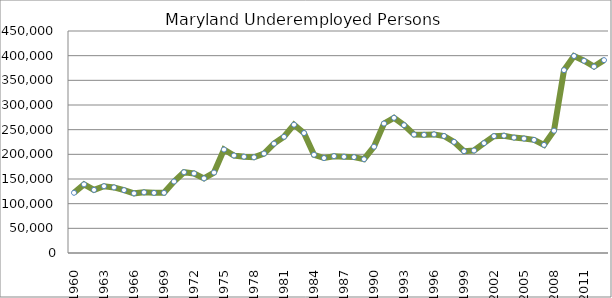
| Category | Series 0 |
|---|---|
| 1960.0 | 122069.561 |
| 1961.0 | 139093.16 |
| 1962.0 | 127951.486 |
| 1963.0 | 135360.774 |
| 1964.0 | 132930.469 |
| 1965.0 | 127417.167 |
| 1966.0 | 120899.965 |
| 1967.0 | 122928.597 |
| 1968.0 | 121911.734 |
| 1969.0 | 122127.808 |
| 1970.0 | 144879.572 |
| 1971.0 | 163694.701 |
| 1972.0 | 161269.304 |
| 1973.0 | 151303.896 |
| 1974.0 | 163090.661 |
| 1975.0 | 209710.079 |
| 1976.0 | 197641.403 |
| 1977.0 | 195246.772 |
| 1978.0 | 194050.112 |
| 1979.0 | 201592.2 |
| 1980.0 | 221690.186 |
| 1981.0 | 235575.411 |
| 1982.0 | 260121.944 |
| 1983.0 | 243148.122 |
| 1984.0 | 199195.631 |
| 1985.0 | 192505.749 |
| 1986.0 | 196260.251 |
| 1987.0 | 195119.298 |
| 1988.0 | 194353.008 |
| 1989.0 | 190087.041 |
| 1990.0 | 215456.462 |
| 1991.0 | 262464.113 |
| 1992.0 | 274019.39 |
| 1993.0 | 259108.327 |
| 1994.0 | 240157.31 |
| 1995.0 | 239616.638 |
| 1996.0 | 240429.177 |
| 1997.0 | 237135.887 |
| 1998.0 | 225173.717 |
| 1999.0 | 206457.353 |
| 2000.0 | 207764.89 |
| 2001.0 | 222594.388 |
| 2002.0 | 236848.819 |
| 2003.0 | 237792.824 |
| 2004.0 | 233930.044 |
| 2005.0 | 232037.165 |
| 2006.0 | 229259.081 |
| 2007.0 | 219139.143 |
| 2008.0 | 247922.001 |
| 2009.0 | 370658.204 |
| 2010.0 | 399326.85 |
| 2011.0 | 389687.004 |
| 2012.0 | 377838.109 |
| 2013.0 | 390959.5 |